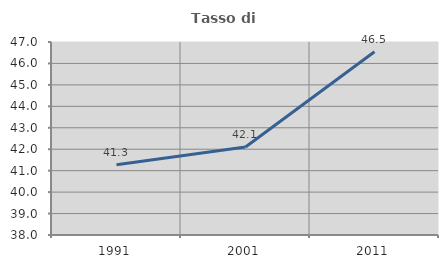
| Category | Tasso di occupazione   |
|---|---|
| 1991.0 | 41.278 |
| 2001.0 | 42.105 |
| 2011.0 | 46.543 |